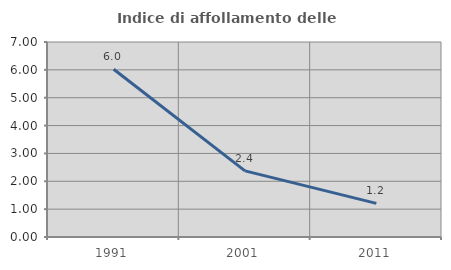
| Category | Indice di affollamento delle abitazioni  |
|---|---|
| 1991.0 | 6.023 |
| 2001.0 | 2.374 |
| 2011.0 | 1.207 |